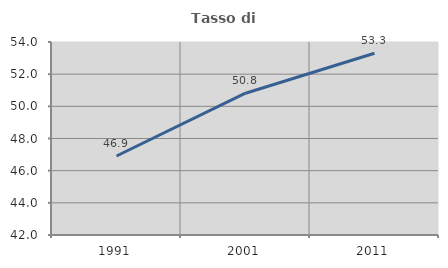
| Category | Tasso di occupazione   |
|---|---|
| 1991.0 | 46.912 |
| 2001.0 | 50.815 |
| 2011.0 | 53.3 |